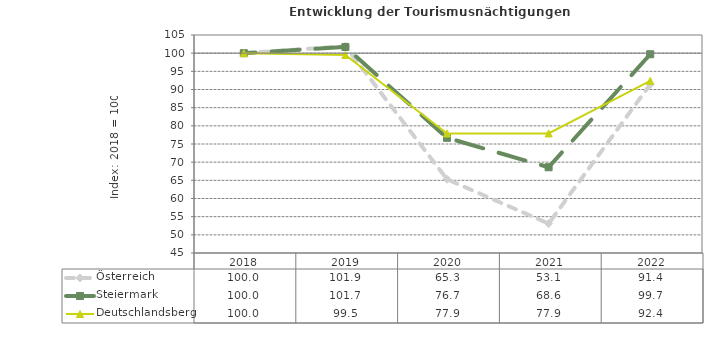
| Category | Österreich | Steiermark | Deutschlandsberg |
|---|---|---|---|
| 2022.0 | 91.4 | 99.7 | 92.4 |
| 2021.0 | 53.1 | 68.6 | 77.9 |
| 2020.0 | 65.3 | 76.7 | 77.9 |
| 2019.0 | 101.9 | 101.7 | 99.5 |
| 2018.0 | 100 | 100 | 100 |